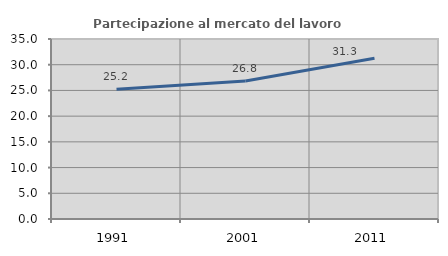
| Category | Partecipazione al mercato del lavoro  femminile |
|---|---|
| 1991.0 | 25.226 |
| 2001.0 | 26.825 |
| 2011.0 | 31.269 |